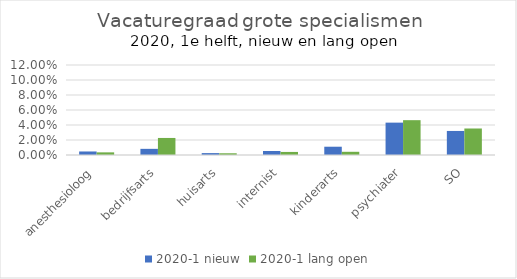
| Category | 2020-1 |
|---|---|
| anesthesioloog | 0.004 |
| bedrijfsarts | 0.023 |
| huisarts | 0.002 |
| internist | 0.004 |
| kinderarts | 0.004 |
| psychiater | 0.046 |
| SO | 0.035 |